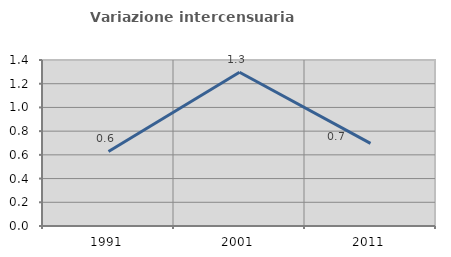
| Category | Variazione intercensuaria annua |
|---|---|
| 1991.0 | 0.628 |
| 2001.0 | 1.297 |
| 2011.0 | 0.697 |